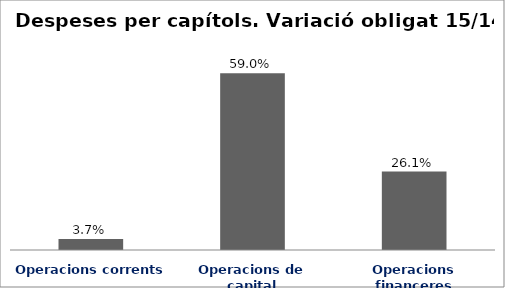
| Category | Series 0 |
|---|---|
| Operacions corrents | 0.037 |
| Operacions de capital | 0.59 |
| Operacions financeres | 0.261 |